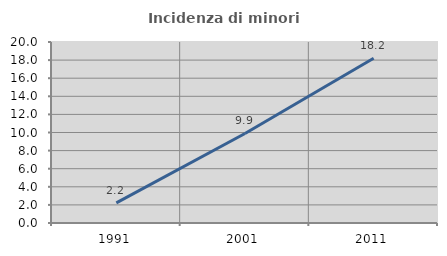
| Category | Incidenza di minori stranieri |
|---|---|
| 1991.0 | 2.222 |
| 2001.0 | 9.89 |
| 2011.0 | 18.209 |